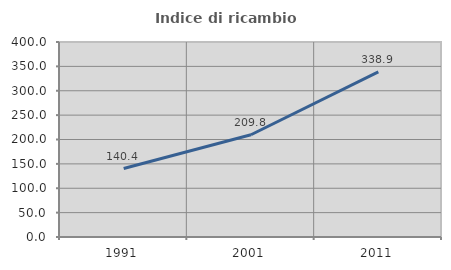
| Category | Indice di ricambio occupazionale  |
|---|---|
| 1991.0 | 140.385 |
| 2001.0 | 209.756 |
| 2011.0 | 338.889 |